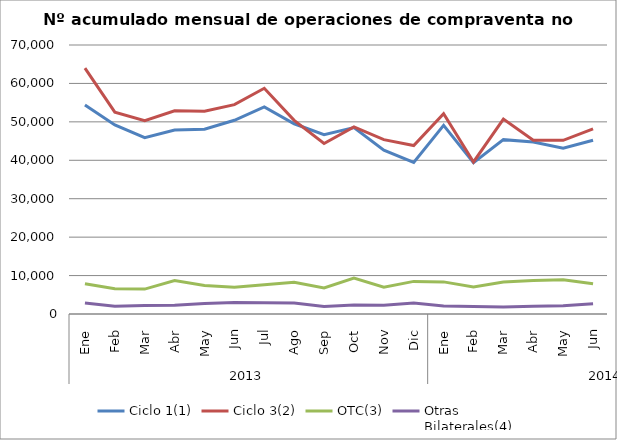
| Category | Ciclo 1(1) | Ciclo 3(2) | OTC(3) | Otras
Bilaterales(4) |
|---|---|---|---|---|
| 0 | 54386 | 63960 | 7873 | 2891 |
| 1 | 49196 | 52525 | 6550 | 2012 |
| 2 | 45892 | 50320 | 6475 | 2233 |
| 3 | 47876 | 52874 | 8686 | 2274 |
| 4 | 48091 | 52767 | 7394 | 2733 |
| 5 | 50415 | 54485 | 6994 | 3021 |
| 6 | 53879 | 58744 | 7586 | 2959 |
| 7 | 49504 | 50401 | 8243 | 2889 |
| 8 | 46688 | 44370 | 6784 | 1951 |
| 9 | 48531 | 48693 | 9357 | 2324 |
| 10 | 42642 | 45362 | 7000 | 2275 |
| 11 | 39447 | 43831 | 8487 | 2831 |
| 12 | 49087 | 52117 | 8357 | 2090 |
| 13 | 39397 | 39565 | 7045 | 1958 |
| 14 | 45373 | 50721 | 8313 | 1843 |
| 15 | 44744 | 45214 | 8739 | 2016 |
| 16 | 43118 | 45196 | 8896 | 2164 |
| 17 | 45225 | 48182 | 7881 | 2648 |